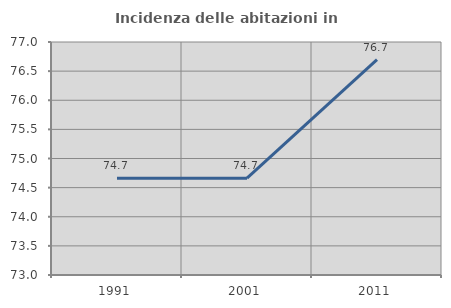
| Category | Incidenza delle abitazioni in proprietà  |
|---|---|
| 1991.0 | 74.659 |
| 2001.0 | 74.661 |
| 2011.0 | 76.696 |